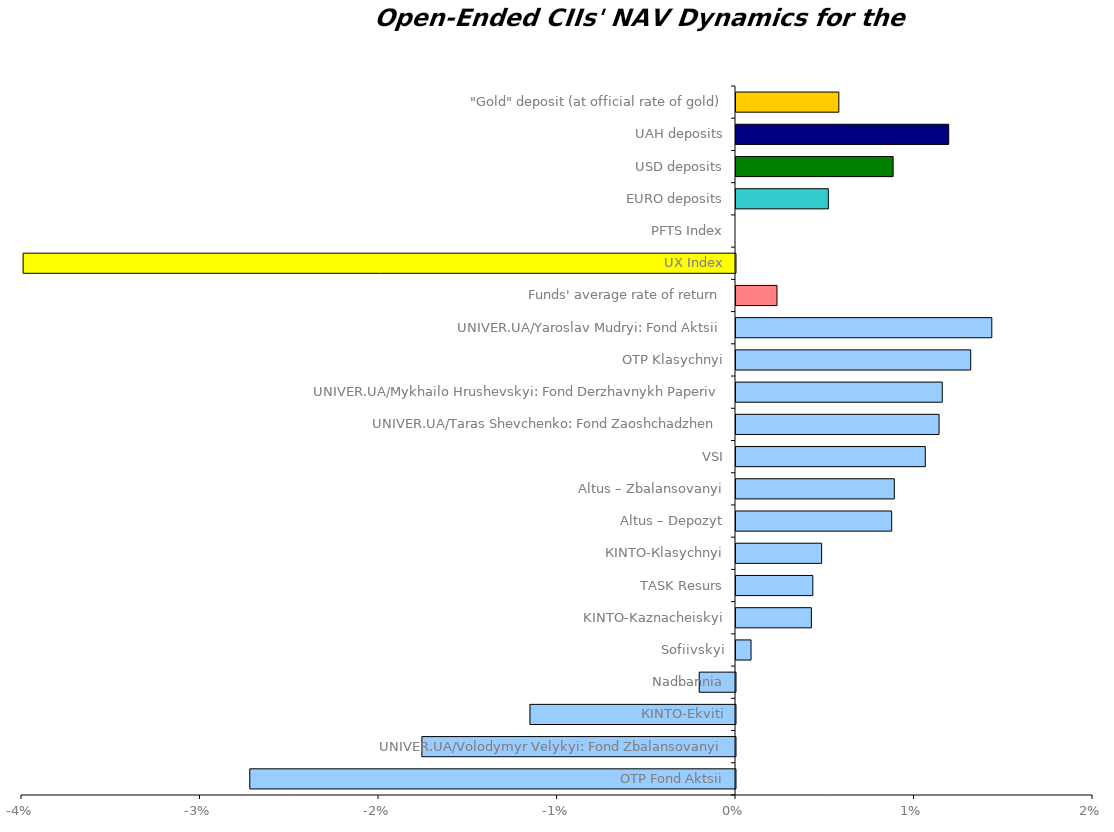
| Category | Series 0 |
|---|---|
| ОТP Fond Aktsii | -0.027 |
| UNIVER.UA/Volodymyr Velykyi: Fond Zbalansovanyi | -0.018 |
| КІNTO-Ekviti | -0.012 |
| Nadbannia | -0.002 |
| Sofiivskyi | 0.001 |
| KINTO-Kaznacheiskyi | 0.004 |
| ТАSK Resurs | 0.004 |
| КІNТО-Кlasychnyi | 0.005 |
| Altus – Depozyt | 0.009 |
| Altus – Zbalansovanyi | 0.009 |
| VSI | 0.011 |
| UNIVER.UA/Taras Shevchenko: Fond Zaoshchadzhen | 0.011 |
| UNIVER.UA/Мykhailo Hrushevskyi: Fond Derzhavnykh Paperiv | 0.012 |
| OTP Klasychnyi | 0.013 |
| UNIVER.UA/Yaroslav Mudryi: Fond Aktsii | 0.014 |
| Funds' average rate of return | 0.002 |
| UX Index | -0.04 |
| PFTS Index | 0 |
| EURO deposits | 0.005 |
| USD deposits | 0.009 |
| UAH deposits | 0.012 |
| "Gold" deposit (at official rate of gold) | 0.006 |